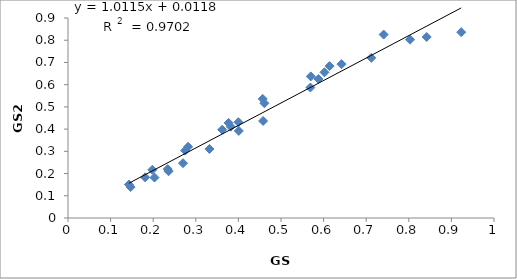
| Category | Series 0 |
|---|---|
| 0.181 | 0.183 |
| 0.198 | 0.217 |
| 0.147 | 0.139 |
| 0.382 | 0.411 |
| 0.4 | 0.431 |
| 0.143 | 0.15 |
| 0.282 | 0.32 |
| 0.614 | 0.684 |
| 0.842 | 0.815 |
| 0.275 | 0.303 |
| 0.461 | 0.516 |
| 0.377 | 0.428 |
| 0.362 | 0.397 |
| 0.401 | 0.392 |
| 0.457 | 0.536 |
| 0.602 | 0.656 |
| 0.569 | 0.587 |
| 0.642 | 0.692 |
| 0.57 | 0.637 |
| 0.588 | 0.625 |
| 0.741 | 0.825 |
| 0.803 | 0.803 |
| 0.712 | 0.721 |
| 0.923 | 0.836 |
| 0.458 | 0.437 |
| 0.236 | 0.21 |
| 0.27 | 0.247 |
| 0.332 | 0.31 |
| 0.203 | 0.182 |
| 0.234 | 0.22 |